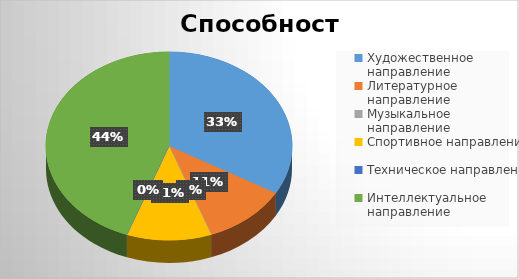
| Category | Series 0 |
|---|---|
| Художественное направление | 3 |
| Литературное направление | 1 |
| Музыкальное направление | 0 |
| Спортивное направление | 1 |
| Техническое направление | 0 |
| Интеллектуальное направление | 4 |